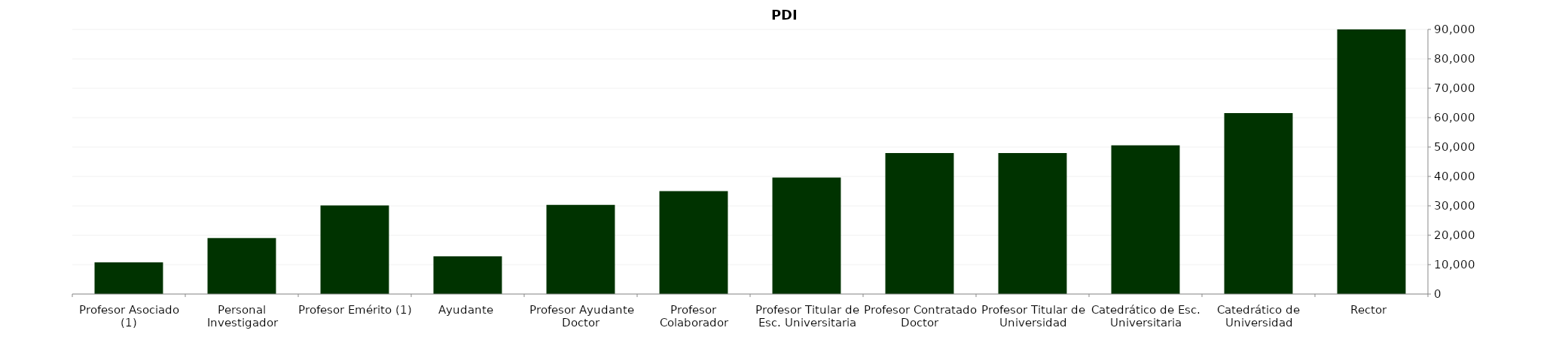
| Category | PDI |
|---|---|
| Rector | 90975.53 |
| Catedrático de Universidad | 61547.741 |
| Catedrático de Esc. Universitaria | 50589.23 |
| Profesor Titular de Universidad | 47933.556 |
| Profesor Contratado Doctor | 47951.604 |
| Profesor Titular de Esc. Universitaria | 39601.359 |
| Profesor Colaborador | 34970.382 |
| Profesor Ayudante Doctor | 30344.032 |
| Ayudante | 12810.091 |
| Profesor Emérito (1) | 30106.262 |
| Personal Investigador | 19035.666 |
| Profesor Asociado (1) | 10741.181 |